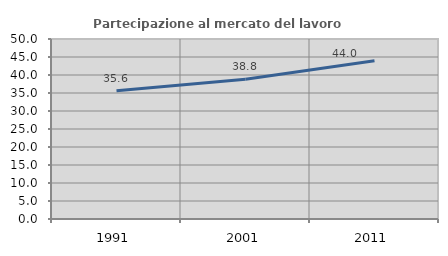
| Category | Partecipazione al mercato del lavoro  femminile |
|---|---|
| 1991.0 | 35.638 |
| 2001.0 | 38.789 |
| 2011.0 | 43.974 |